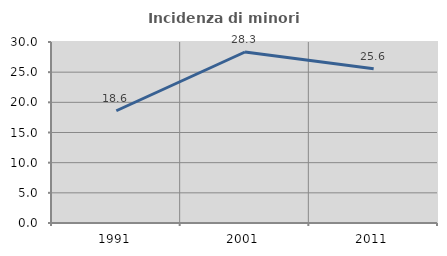
| Category | Incidenza di minori stranieri |
|---|---|
| 1991.0 | 18.605 |
| 2001.0 | 28.342 |
| 2011.0 | 25.556 |